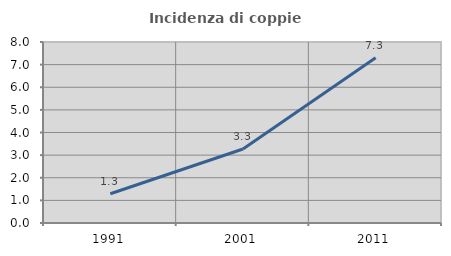
| Category | Incidenza di coppie miste |
|---|---|
| 1991.0 | 1.293 |
| 2001.0 | 3.271 |
| 2011.0 | 7.303 |